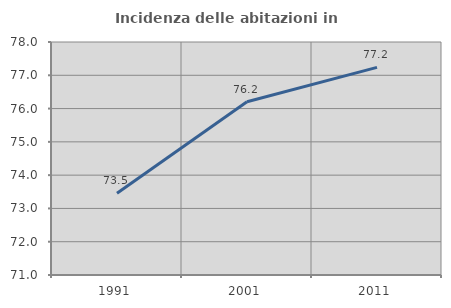
| Category | Incidenza delle abitazioni in proprietà  |
|---|---|
| 1991.0 | 73.454 |
| 2001.0 | 76.204 |
| 2011.0 | 77.237 |